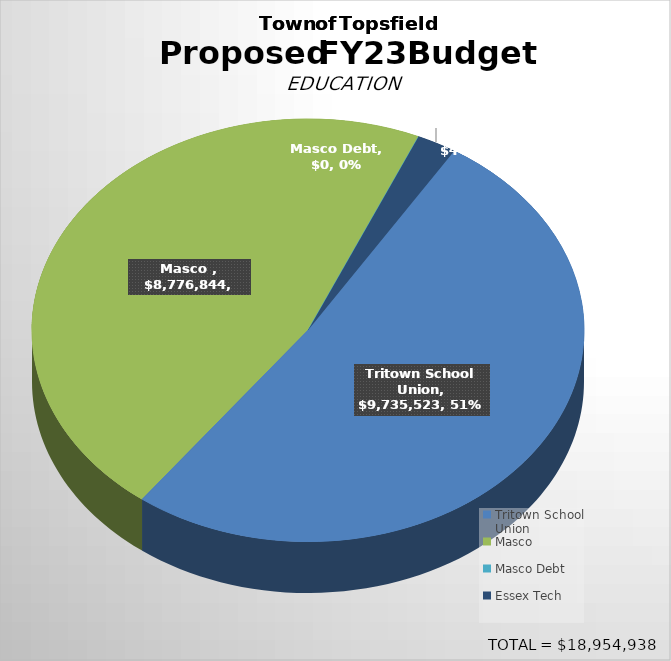
| Category | Series 0 |
|---|---|
| Tritown School Union | 9735523 |
| Masco  | 8776844 |
| Masco Debt | 0 |
| Essex Tech | 442571 |